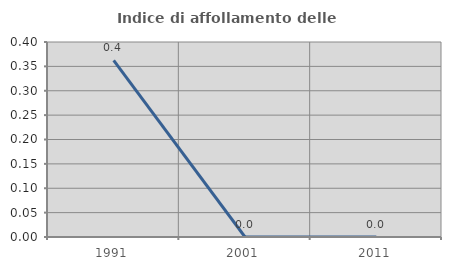
| Category | Indice di affollamento delle abitazioni  |
|---|---|
| 1991.0 | 0.362 |
| 2001.0 | 0 |
| 2011.0 | 0 |